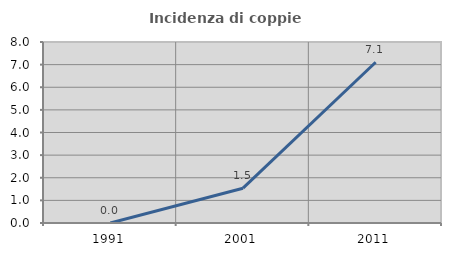
| Category | Incidenza di coppie miste |
|---|---|
| 1991.0 | 0 |
| 2001.0 | 1.538 |
| 2011.0 | 7.107 |